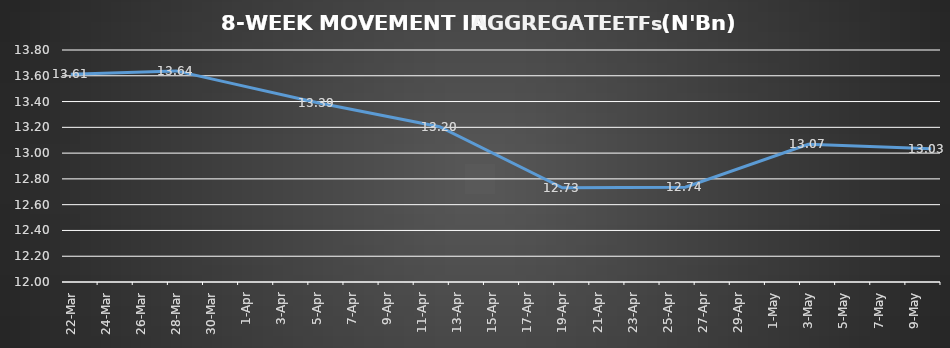
| Category | ETFs AGGREGATE |
|---|---|
| 2024-03-22 | 13.612 |
| 2024-03-28 | 13.638 |
| 2024-04-05 | 13.392 |
| 2024-04-12 | 13.205 |
| 2024-04-19 | 12.73 |
| 2024-04-26 | 12.735 |
| 2024-05-03 | 13.068 |
| 2024-05-10 | 13.034 |